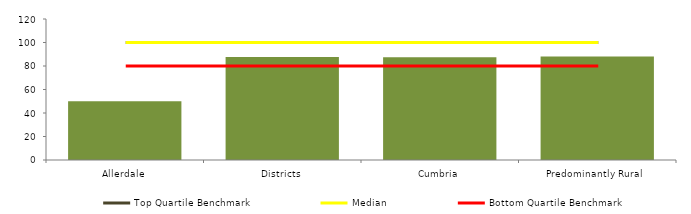
| Category | Block Data |
|---|---|
| Allerdale | 50 |
| Districts | 87.572 |
| Cumbria | 87.5 |
|  Predominantly Rural   | 88.088 |